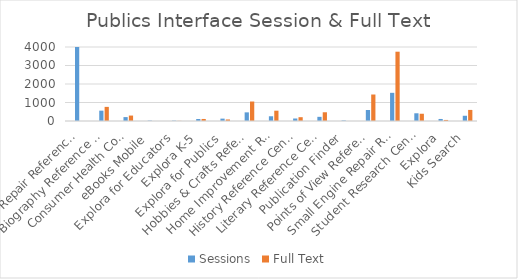
| Category | Series 0 | Sessions | Full Text |
|---|---|---|---|
| Auto Repair Reference Center |  | 8331 | 0 |
| Biography Reference Center |  | 559 | 763 |
| Consumer Health Complete |  | 211 | 294 |
| eBooks Mobile |  | 21 | 0 |
| Explora for Educators |  | 19 | 8 |
| Explora K-5 |  | 107 | 110 |
| Explora for Publics |  | 128 | 83 |
| Hobbies & Crafts Reference Center |  | 467 | 1053 |
| Home Improvement Reference Center |  | 256 | 557 |
| History Reference Center |  | 135 | 206 |
| Literary Reference Center / LRC Plus |  | 225 | 472 |
| Publication Finder |  | 29 | 0 |
| Points of View Reference Center |  | 594 | 1432 |
| Small Engine Repair Reference Center |  | 1523 | 3746 |
| Student Research Center |  | 417 | 392 |
| Explora |  | 110 | 57 |
| Kids Search |  | 283 | 599 |